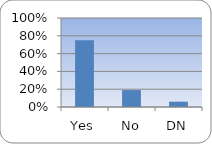
| Category | Series 0 |
|---|---|
| Yes | 0.75 |
| No | 0.19 |
| DN | 0.06 |